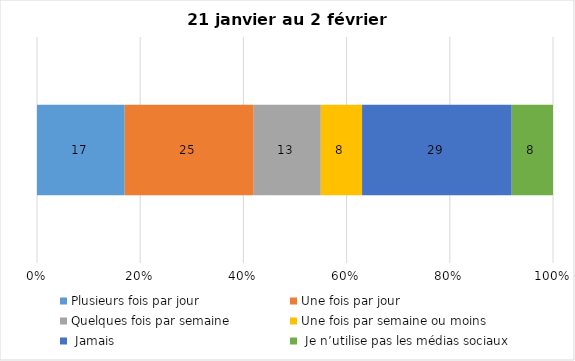
| Category | Plusieurs fois par jour | Une fois par jour | Quelques fois par semaine   | Une fois par semaine ou moins   |  Jamais   |  Je n’utilise pas les médias sociaux |
|---|---|---|---|---|---|---|
| 0 | 17 | 25 | 13 | 8 | 29 | 8 |